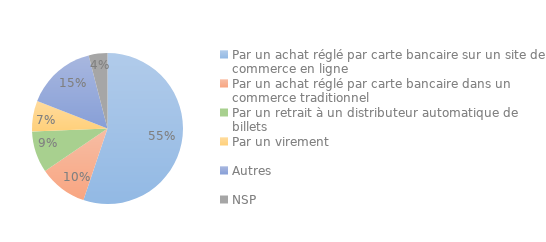
| Category | Series 0 |
|---|---|
| Par un achat réglé par carte bancaire sur un site de commerce en ligne | 0.549 |
| Par un achat réglé par carte bancaire dans un commerce traditionnel | 0.103 |
| Par un retrait à un distributeur automatique de billets | 0.088 |
| Par un virement | 0.065 |
| Autres | 0.15 |
| NSP | 0.04 |